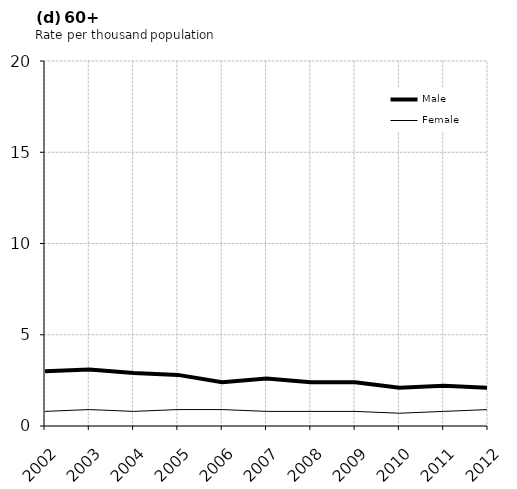
| Category | Male | Female |
|---|---|---|
| 2002.0 | 3 | 0.8 |
| 2003.0 | 3.1 | 0.9 |
| 2004.0 | 2.9 | 0.8 |
| 2005.0 | 2.8 | 0.9 |
| 2006.0 | 2.4 | 0.9 |
| 2007.0 | 2.6 | 0.8 |
| 2008.0 | 2.4 | 0.8 |
| 2009.0 | 2.4 | 0.8 |
| 2010.0 | 2.1 | 0.7 |
| 2011.0 | 2.2 | 0.8 |
| 2012.0 | 2.1 | 0.9 |